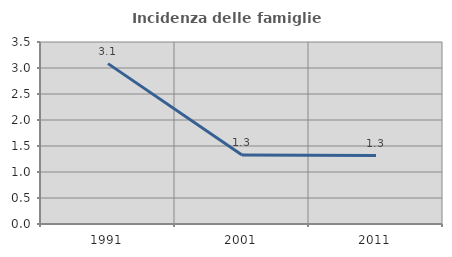
| Category | Incidenza delle famiglie numerose |
|---|---|
| 1991.0 | 3.084 |
| 2001.0 | 1.328 |
| 2011.0 | 1.317 |